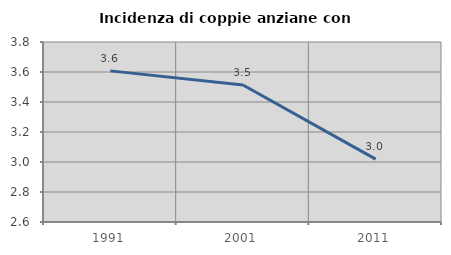
| Category | Incidenza di coppie anziane con figli |
|---|---|
| 1991.0 | 3.608 |
| 2001.0 | 3.514 |
| 2011.0 | 3.019 |